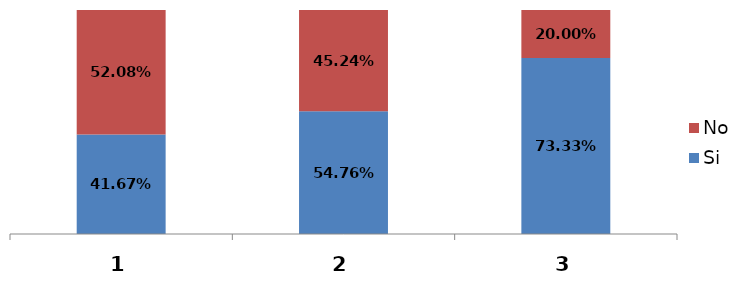
| Category | Si | No |
|---|---|---|
| 0 | 0.417 | 0.521 |
| 1 | 0.548 | 0.452 |
| 2 | 0.733 | 0.2 |